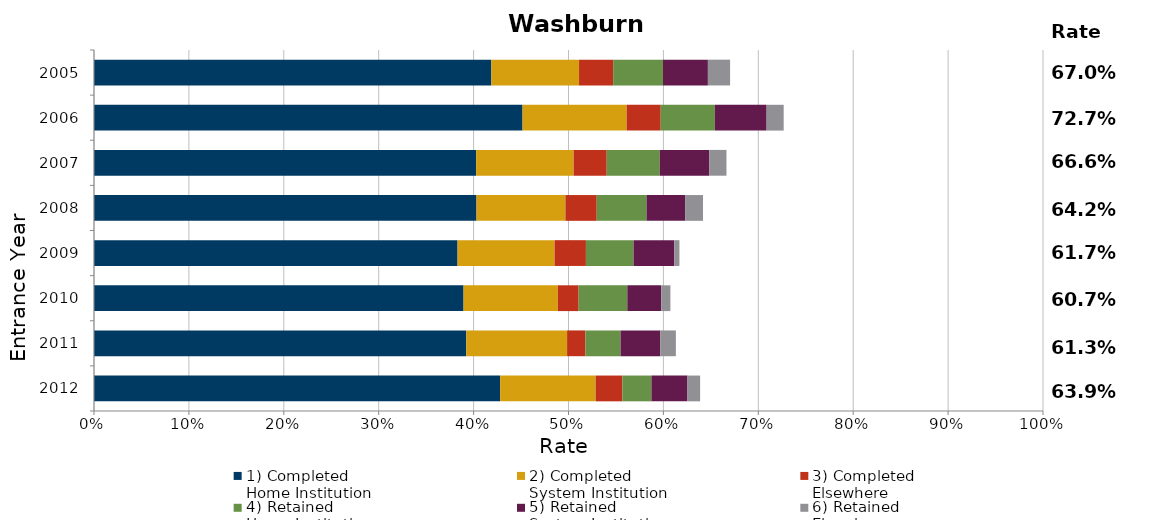
| Category | 1) Completed 
Home Institution | 2) Completed 
System Institution | 3) Completed 
Elsewhere | 4) Retained 
Home Institution | 5) Retained 
System Institution | 6) Retained 
Elsewhere | 7) Stopped Out |
|---|---|---|---|---|---|---|---|
| 2012.0 | 0.428 | 0.101 | 0.028 | 0.031 | 0.038 | 0.013 | 0.361 |
| 2011.0 | 0.392 | 0.106 | 0.019 | 0.037 | 0.042 | 0.016 | 0.387 |
| 2010.0 | 0.389 | 0.099 | 0.022 | 0.051 | 0.036 | 0.01 | 0.393 |
| 2009.0 | 0.383 | 0.102 | 0.033 | 0.05 | 0.043 | 0.006 | 0.383 |
| 2008.0 | 0.403 | 0.094 | 0.033 | 0.052 | 0.041 | 0.019 | 0.358 |
| 2007.0 | 0.403 | 0.103 | 0.035 | 0.056 | 0.052 | 0.018 | 0.334 |
| 2006.0 | 0.452 | 0.11 | 0.036 | 0.057 | 0.055 | 0.018 | 0.273 |
| 2005.0 | 0.419 | 0.092 | 0.036 | 0.052 | 0.047 | 0.023 | 0.33 |